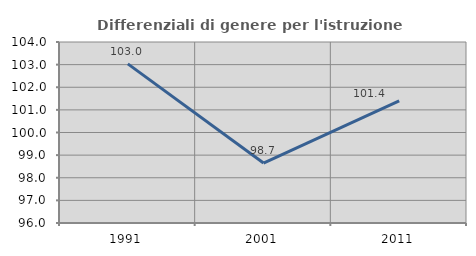
| Category | Differenziali di genere per l'istruzione superiore |
|---|---|
| 1991.0 | 103.032 |
| 2001.0 | 98.651 |
| 2011.0 | 101.397 |